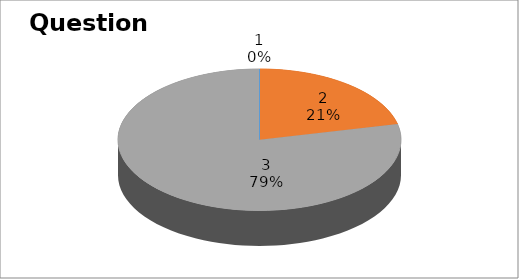
| Category | Series 0 |
|---|---|
| 0 | 0 |
| 1 | 3 |
| 2 | 11 |